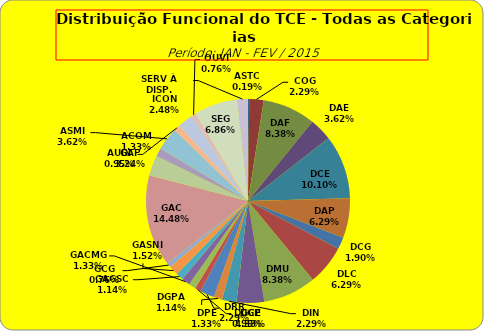
| Category | ASTC COG DAF DAE DCE DAP DCG DLC DMU DGP DIN DPE DRR DGCE DGPA GACMG GAGSC GASNI GCG GAC GAP ACOM ASMI AUDI ICON OUVI SEG SERV À DISP. |
|---|---|
| ASTC | 1 |
| COG | 12 |
| DAF | 44 |
| DAE | 19 |
| DCE | 53 |
| DAP | 33 |
| DCG | 10 |
| DLC | 33 |
| DMU | 44 |
| DGP | 23 |
| DIN | 12 |
| DPE | 7 |
| DRR | 12 |
| DGCE | 5 |
| DGPA | 6 |
| GACMG | 7 |
| GAGSC | 6 |
| GASNI | 8 |
| GCG | 4 |
| GAC | 76 |
| GAP | 17 |
| ACOM | 7 |
| ASMI | 19 |
| AUDI | 5 |
| ICON | 13 |
| OUVI | 4 |
| SEG | 36 |
| SERV À DISP. | 9 |